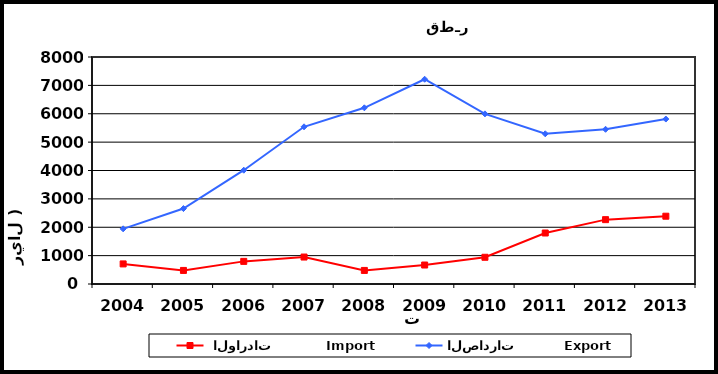
| Category |  الواردات           Import | الصادرات          Export |
|---|---|---|
| 2004.0 | 708 | 1944 |
| 2005.0 | 478 | 2659 |
| 2006.0 | 797 | 4010 |
| 2007.0 | 950 | 5540 |
| 2008.0 | 478 | 6209 |
| 2009.0 | 669 | 7216 |
| 2010.0 | 942 | 5996 |
| 2011.0 | 1797 | 5294 |
| 2012.0 | 2268 | 5452 |
| 2013.0 | 2389 | 5813 |